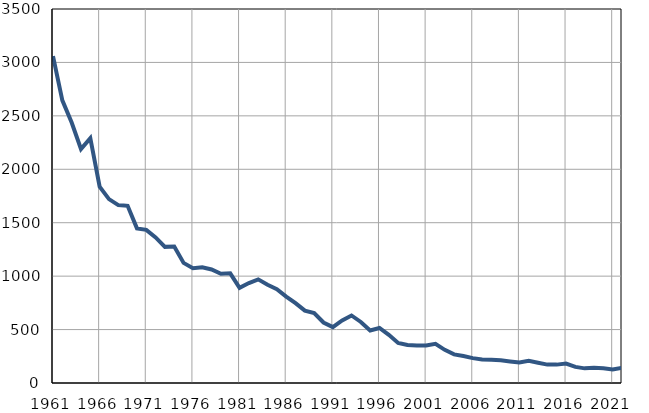
| Category | Умрла 
одојчад |
|---|---|
| 1961.0 | 3059 |
| 1962.0 | 2645 |
| 1963.0 | 2437 |
| 1964.0 | 2190 |
| 1965.0 | 2292 |
| 1966.0 | 1837 |
| 1967.0 | 1721 |
| 1968.0 | 1665 |
| 1969.0 | 1658 |
| 1970.0 | 1447 |
| 1971.0 | 1433 |
| 1972.0 | 1362 |
| 1973.0 | 1274 |
| 1974.0 | 1278 |
| 1975.0 | 1124 |
| 1976.0 | 1075 |
| 1977.0 | 1082 |
| 1978.0 | 1062 |
| 1979.0 | 1022 |
| 1980.0 | 1026 |
| 1981.0 | 890 |
| 1982.0 | 935 |
| 1983.0 | 970 |
| 1984.0 | 919 |
| 1985.0 | 878 |
| 1986.0 | 809 |
| 1987.0 | 747 |
| 1988.0 | 677 |
| 1989.0 | 654 |
| 1990.0 | 566 |
| 1991.0 | 523 |
| 1992.0 | 586 |
| 1993.0 | 632 |
| 1994.0 | 571 |
| 1995.0 | 491 |
| 1996.0 | 515 |
| 1997.0 | 451 |
| 1998.0 | 375 |
| 1999.0 | 356 |
| 2000.0 | 351 |
| 2001.0 | 351 |
| 2002.0 | 367 |
| 2003.0 | 310 |
| 2004.0 | 268 |
| 2005.0 | 252 |
| 2006.0 | 233 |
| 2007.0 | 219 |
| 2008.0 | 218 |
| 2009.0 | 213 |
| 2010.0 | 202 |
| 2011.0 | 191 |
| 2012.0 | 207 |
| 2013.0 | 190 |
| 2014.0 | 172 |
| 2015.0 | 172 |
| 2016.0 | 182 |
| 2017.0 | 151 |
| 2018.0 | 137 |
| 2019.0 | 143 |
| 2020.0 | 138 |
| 2021.0 | 126 |
| 2022.0 | 143 |